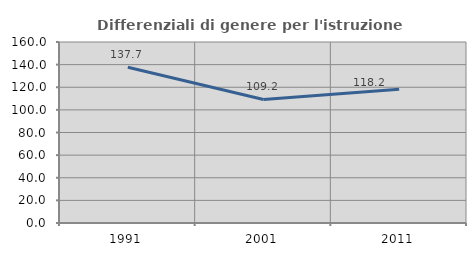
| Category | Differenziali di genere per l'istruzione superiore |
|---|---|
| 1991.0 | 137.683 |
| 2001.0 | 109.245 |
| 2011.0 | 118.155 |